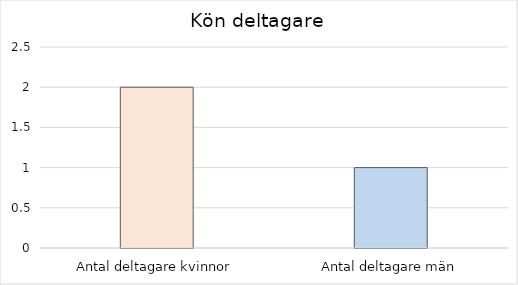
| Category | Series 0 |
|---|---|
| Antal deltagare kvinnor | 2 |
| Antal deltagare män | 1 |